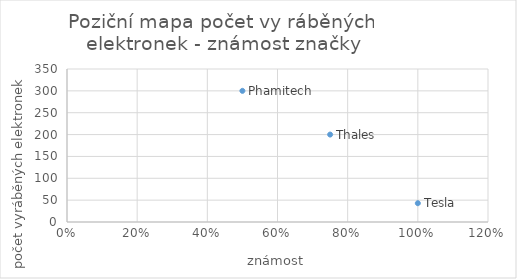
| Category | Series 0 |
|---|---|
| 1.0 | 43 |
| 0.75 | 200 |
| 0.5 | 300 |